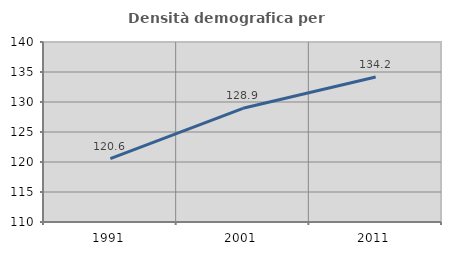
| Category | Densità demografica |
|---|---|
| 1991.0 | 120.557 |
| 2001.0 | 128.948 |
| 2011.0 | 134.171 |